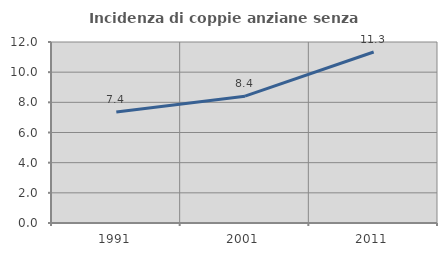
| Category | Incidenza di coppie anziane senza figli  |
|---|---|
| 1991.0 | 7.362 |
| 2001.0 | 8.408 |
| 2011.0 | 11.337 |